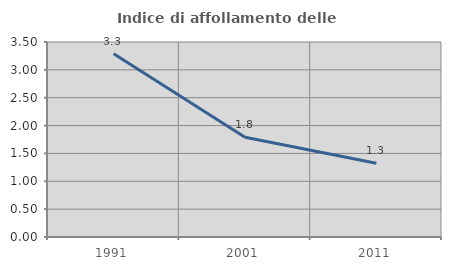
| Category | Indice di affollamento delle abitazioni  |
|---|---|
| 1991.0 | 3.288 |
| 2001.0 | 1.791 |
| 2011.0 | 1.325 |